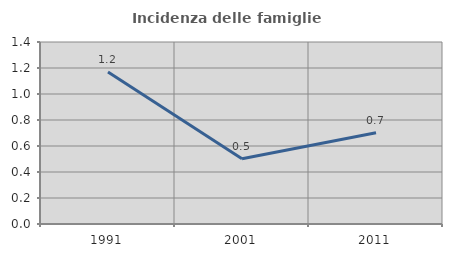
| Category | Incidenza delle famiglie numerose |
|---|---|
| 1991.0 | 1.169 |
| 2001.0 | 0.503 |
| 2011.0 | 0.702 |